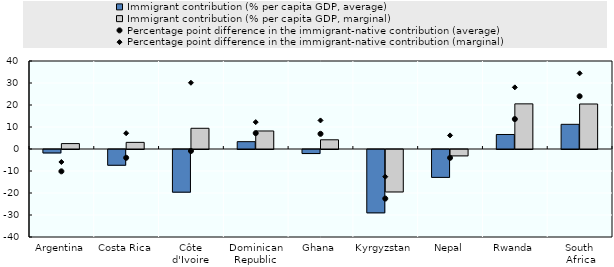
| Category | Immigrant contribution (% per capita GDP, average) | Immigrant contribution (% per capita GDP, marginal) |
|---|---|---|
| Argentina | -1.566 | 2.458 |
| Costa Rica | -7.16 | 3.014 |
| Côte d'Ivoire | -19.401 | 9.416 |
| Dominican Republic | 3.333 | 8.19 |
| Ghana | -1.839 | 4.187 |
| Kyrgyzstan | -28.8 | -19.3 |
| Nepal | -12.673 | -2.904 |
| Rwanda | 6.592 | 20.524 |
| South Africa | 11.221 | 20.456 |